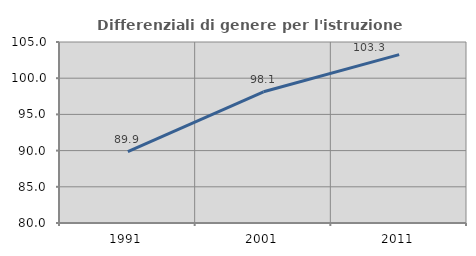
| Category | Differenziali di genere per l'istruzione superiore |
|---|---|
| 1991.0 | 89.867 |
| 2001.0 | 98.125 |
| 2011.0 | 103.258 |